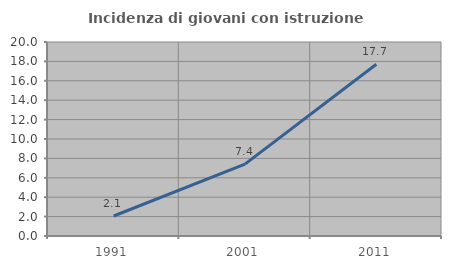
| Category | Incidenza di giovani con istruzione universitaria |
|---|---|
| 1991.0 | 2.06 |
| 2001.0 | 7.412 |
| 2011.0 | 17.71 |